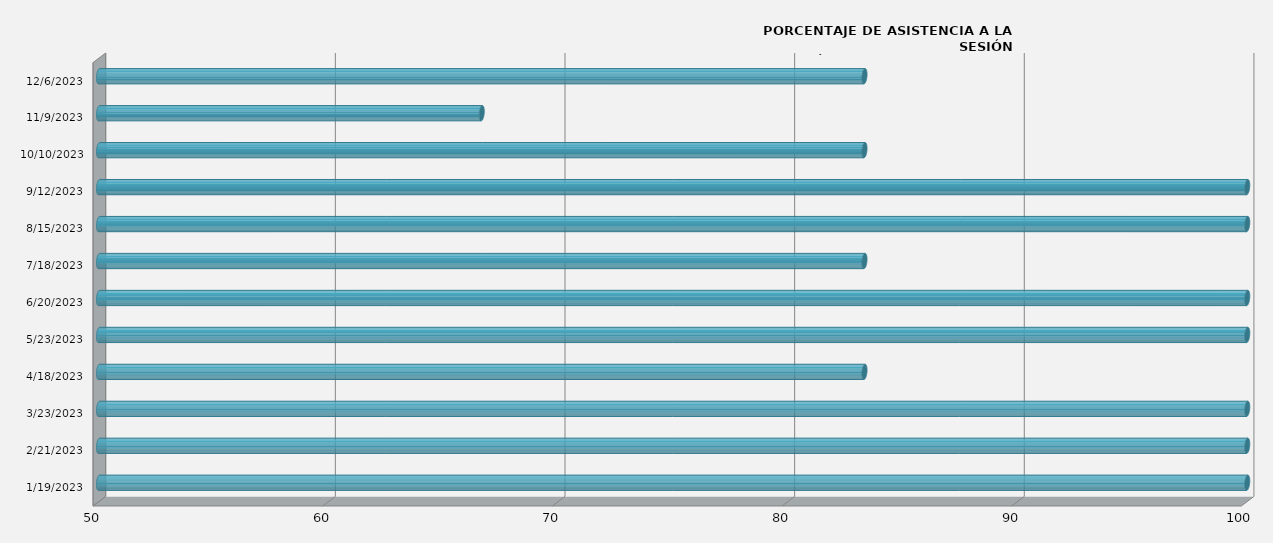
| Category | Series 0 |
|---|---|
| 1/19/23 | 100 |
| 2/21/23 | 100 |
| 3/23/23 | 100 |
| 4/18/23 | 83.333 |
| 5/23/23 | 100 |
| 6/20/23 | 100 |
| 7/18/23 | 83.333 |
| 8/15/23 | 100 |
| 9/12/23 | 100 |
| 10/10/23 | 83.333 |
| 11/9/23 | 66.667 |
| 12/6/23 | 83.333 |